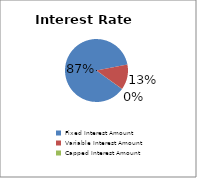
| Category | Series 0 |
|---|---|
| Fixed Interest Amount | 0.869 |
| Variable Interest Amount | 0.13 |
| Capped Interest Amount | 0 |